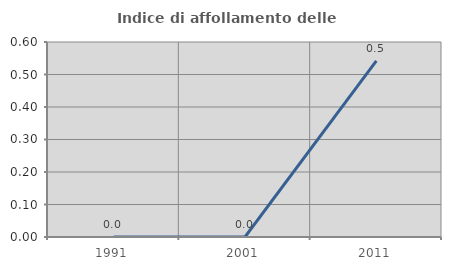
| Category | Indice di affollamento delle abitazioni  |
|---|---|
| 1991.0 | 0 |
| 2001.0 | 0 |
| 2011.0 | 0.542 |